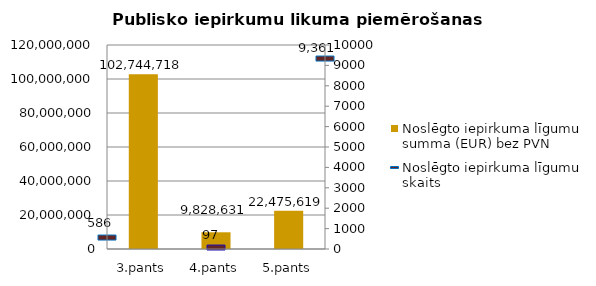
| Category | Noslēgto iepirkuma līgumu summa (EUR) bez PVN |
|---|---|
| 3.pants | 102744718 |
| 4.pants | 9828631 |
| 5.pants | 22475619 |